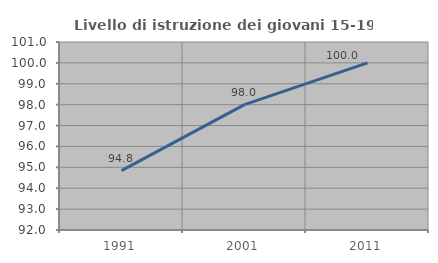
| Category | Livello di istruzione dei giovani 15-19 anni |
|---|---|
| 1991.0 | 94.845 |
| 2001.0 | 98 |
| 2011.0 | 100 |